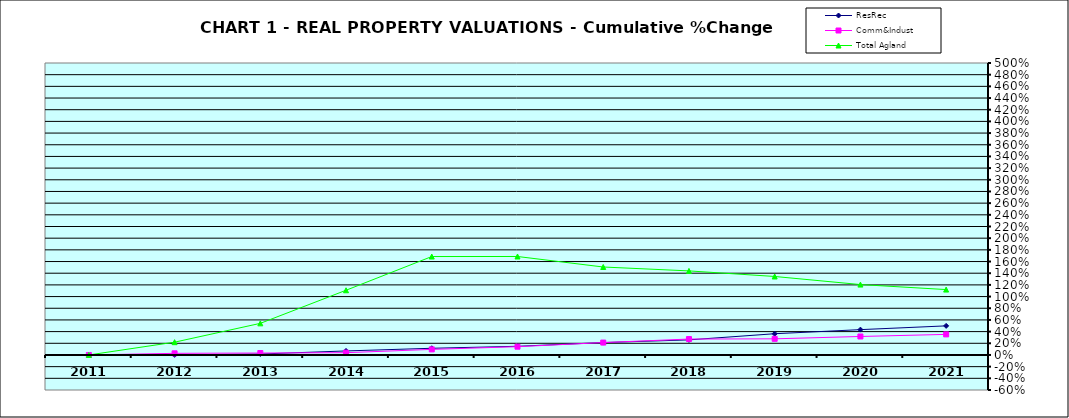
| Category | ResRec | Comm&Indust | Total Agland |
|---|---|---|---|
| 2011.0 | 0 | 0 | 0 |
| 2012.0 | 0.002 | 0.028 | 0.219 |
| 2013.0 | 0.016 | 0.033 | 0.541 |
| 2014.0 | 0.069 | 0.039 | 1.108 |
| 2015.0 | 0.115 | 0.096 | 1.686 |
| 2016.0 | 0.148 | 0.142 | 1.686 |
| 2017.0 | 0.212 | 0.212 | 1.506 |
| 2018.0 | 0.258 | 0.273 | 1.44 |
| 2019.0 | 0.364 | 0.277 | 1.344 |
| 2020.0 | 0.434 | 0.317 | 1.205 |
| 2021.0 | 0.498 | 0.352 | 1.12 |